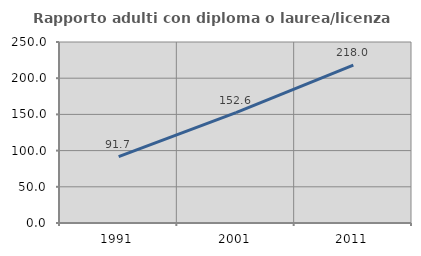
| Category | Rapporto adulti con diploma o laurea/licenza media  |
|---|---|
| 1991.0 | 91.74 |
| 2001.0 | 152.568 |
| 2011.0 | 218.036 |